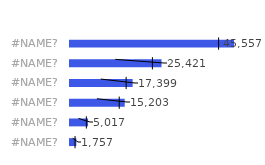
| Category | Продажи |
|---|---|
| Rubok | 1757.366 |
| Babidas | 5017.05 |
| Gunverse | 15203.313 |
| Nuke | 17399.136 |
| Asic | 25420.504 |
| Galosha | 45557.157 |